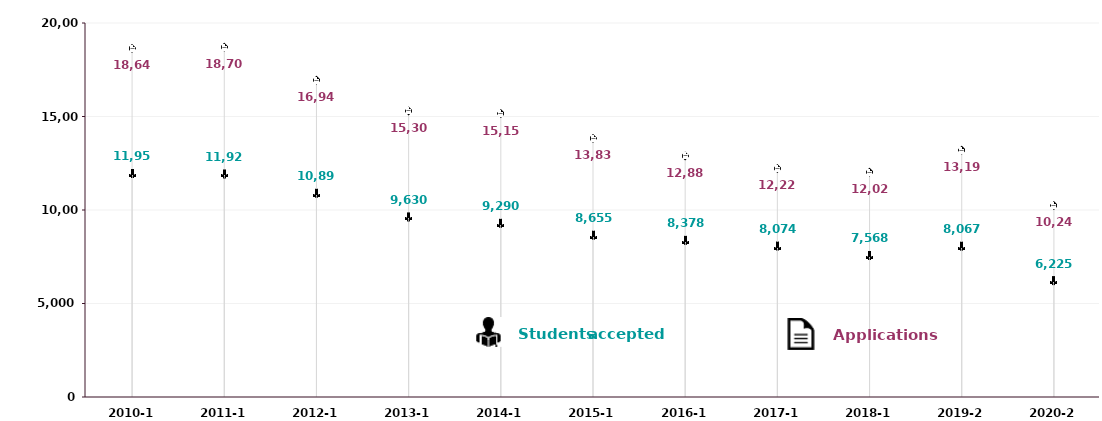
| Category | Applications | Students Accepted |
|---|---|---|
| 2010-11 | 18642 | 11952 |
| 2011-12 | 18707 | 11927 |
| 2012-13 | 16944 | 10897 |
| 2013-14 | 15300 | 9630 |
| 2014-15 | 15157 | 9290 |
| 2015-16 | 13833 | 8655 |
| 2016-17 | 12889 | 8378 |
| 2017-18 | 12221 | 8074 |
| 2018-19 | 12028 | 7568 |
| 2019-20 | 13198 | 8067 |
| 2020-21 | 10242 | 6225 |